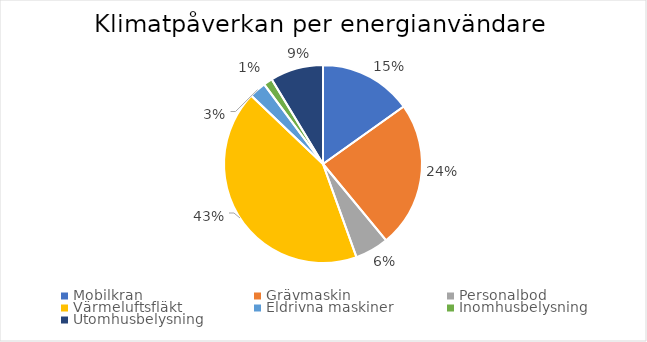
| Category | Series 0 |
|---|---|
| Mobilkran | 0.151 |
| Grävmaskin | 0.239 |
| Personalbod | 0.055 |
| Värmeluftsfläkt | 0.426 |
| Eldrivna maskiner | 0.028 |
| Inomhusbelysning | 0.014 |
| Utomhusbelysning | 0.087 |